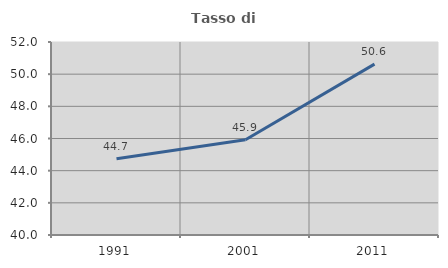
| Category | Tasso di occupazione   |
|---|---|
| 1991.0 | 44.735 |
| 2001.0 | 45.92 |
| 2011.0 | 50.623 |